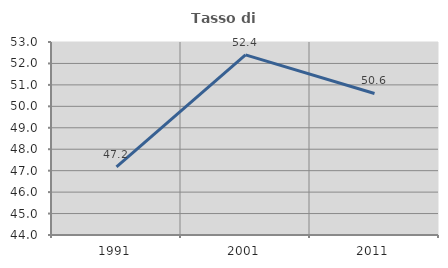
| Category | Tasso di occupazione   |
|---|---|
| 1991.0 | 47.177 |
| 2001.0 | 52.403 |
| 2011.0 | 50.6 |